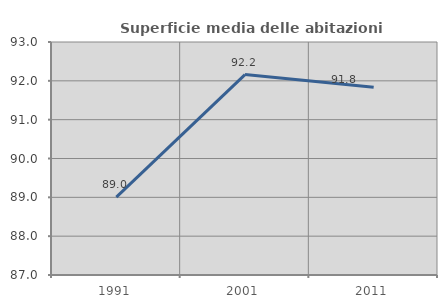
| Category | Superficie media delle abitazioni occupate |
|---|---|
| 1991.0 | 89.004 |
| 2001.0 | 92.161 |
| 2011.0 | 91.837 |